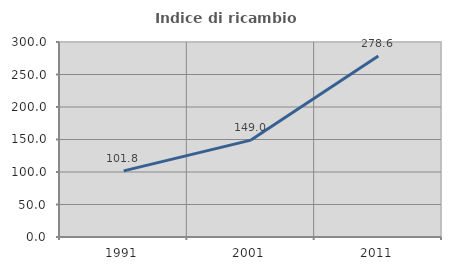
| Category | Indice di ricambio occupazionale  |
|---|---|
| 1991.0 | 101.786 |
| 2001.0 | 149.045 |
| 2011.0 | 278.571 |